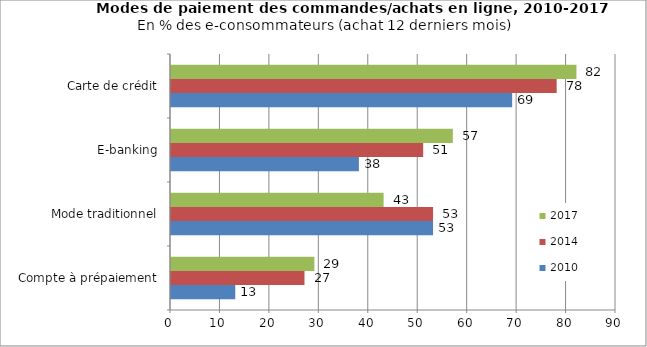
| Category | 2010 | 2014 | 2017 |
|---|---|---|---|
| Compte à prépaiement | 13 | 27 | 29 |
| Mode traditionnel | 53 | 53 | 43 |
| E-banking | 38 | 51 | 57 |
| Carte de crédit | 69 | 78 | 82 |